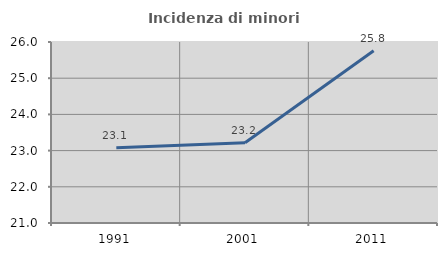
| Category | Incidenza di minori stranieri |
|---|---|
| 1991.0 | 23.077 |
| 2001.0 | 23.214 |
| 2011.0 | 25.758 |